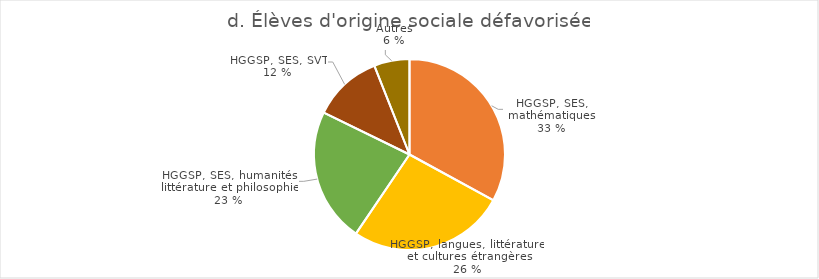
| Category | Élèves d'origine sociale défavorisée |
|---|---|
| HGGSP, SES, mathématiques | 3800 |
| HGGSP, SES, LLCER | 3058 |
| HGGSP, SES, humanités, littérature et philosophie | 2626 |
| HGGSP, SES, SVT | 1356 |
| Autres | 692 |